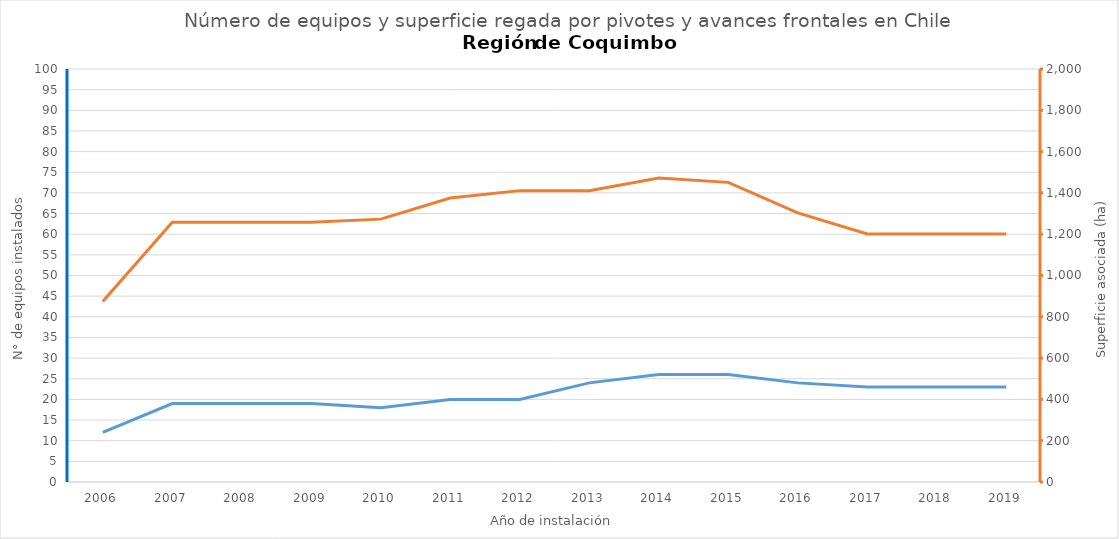
| Category | N° |
|---|---|
| 2006.0 | 12 |
| 2007.0 | 19 |
| 2008.0 | 19 |
| 2009.0 | 19 |
| 2010.0 | 18 |
| 2011.0 | 20 |
| 2012.0 | 20 |
| 2013.0 | 24 |
| 2014.0 | 26 |
| 2015.0 | 26 |
| 2016.0 | 24 |
| 2017.0 | 23 |
| 2018.0 | 23 |
| 2019.0 | 23 |